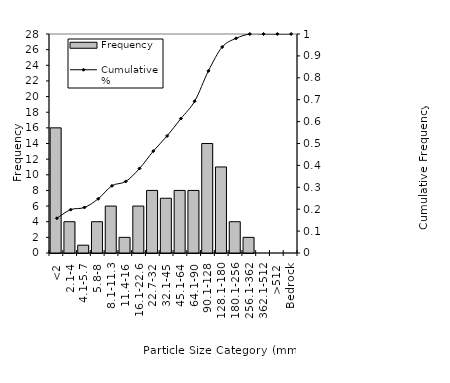
| Category | Frequency |
|---|---|
| <2 | 16 |
| 2.1-4 | 4 |
| 4.1-5.7 | 1 |
| 5.8-8 | 4 |
| 8.1-11.3 | 6 |
| 11.4-16 | 2 |
| 16.1-22.6 | 6 |
| 22.7-32 | 8 |
| 32.1-45 | 7 |
| 45.1-64 | 8 |
| 64.1-90 | 8 |
| 90.1-128 | 14 |
| 128.1-180 | 11 |
| 180.1-256 | 4 |
| 256.1-362 | 2 |
| 362.1-512 | 0 |
| >512 | 0 |
| Bedrock | 0 |